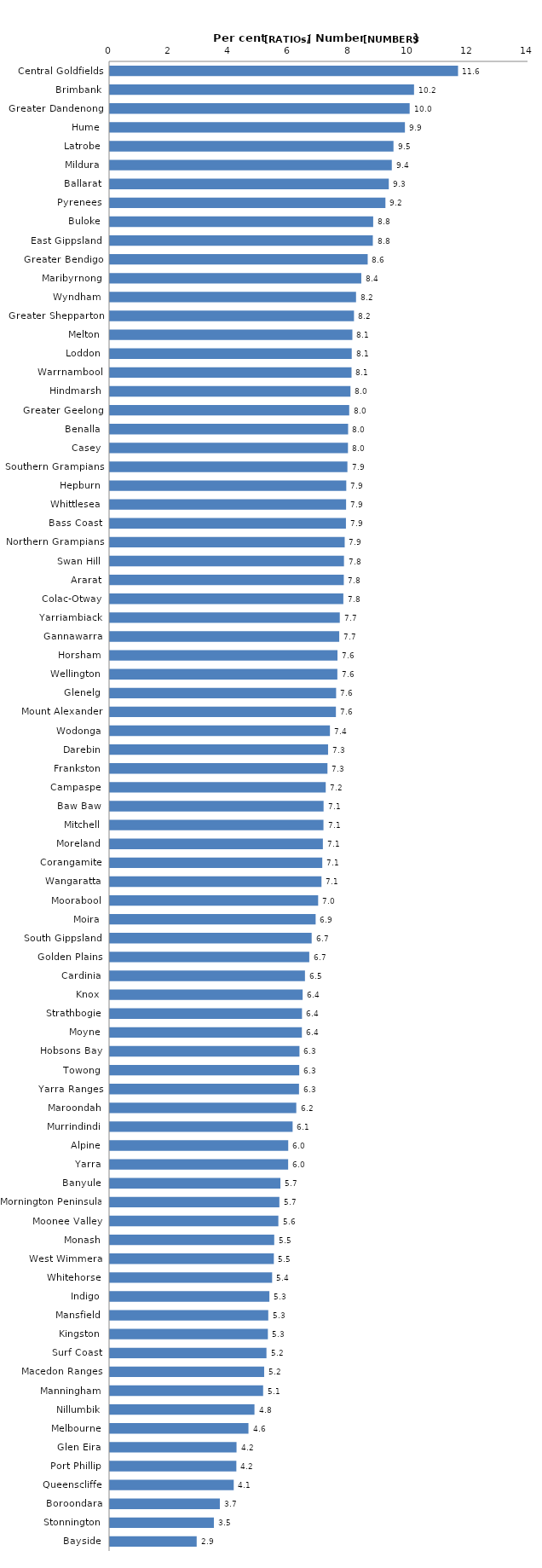
| Category | Series 0 |
|---|---|
| Central Goldfields | 11.647 |
| Brimbank | 10.175 |
| Greater Dandenong | 10.028 |
| Hume | 9.87 |
| Latrobe | 9.487 |
| Mildura | 9.431 |
| Ballarat | 9.33 |
| Pyrenees | 9.217 |
| Buloke | 8.808 |
| East Gippsland | 8.797 |
| Greater Bendigo | 8.624 |
| Maribyrnong | 8.41 |
| Wyndham | 8.234 |
| Greater Shepparton | 8.166 |
| Melton | 8.112 |
| Loddon | 8.09 |
| Warrnambool | 8.083 |
| Hindmarsh | 8.048 |
| Greater Geelong | 8.006 |
| Benalla | 7.969 |
| Casey | 7.964 |
| Southern Grampians | 7.946 |
| Hepburn | 7.907 |
| Whittlesea | 7.901 |
| Bass Coast | 7.896 |
| Northern Grampians | 7.855 |
| Swan Hill | 7.831 |
| Ararat | 7.825 |
| Colac-Otway | 7.809 |
| Yarriambiack | 7.69 |
| Gannawarra | 7.672 |
| Horsham | 7.613 |
| Wellington | 7.609 |
| Glenelg | 7.568 |
| Mount Alexander | 7.561 |
| Wodonga | 7.361 |
| Darebin | 7.299 |
| Frankston | 7.278 |
| Campaspe | 7.22 |
| Baw Baw | 7.148 |
| Mitchell | 7.144 |
| Moreland | 7.125 |
| Corangamite | 7.105 |
| Wangaratta | 7.078 |
| Moorabool | 6.966 |
| Moira | 6.883 |
| South Gippsland | 6.749 |
| Golden Plains | 6.669 |
| Cardinia | 6.525 |
| Knox | 6.448 |
| Strathbogie | 6.426 |
| Moyne | 6.422 |
| Hobsons Bay | 6.341 |
| Towong | 6.334 |
| Yarra Ranges | 6.326 |
| Maroondah | 6.235 |
| Murrindindi | 6.113 |
| Alpine | 5.965 |
| Yarra | 5.963 |
| Banyule | 5.704 |
| Mornington Peninsula | 5.669 |
| Moonee Valley | 5.635 |
| Monash | 5.497 |
| West Wimmera | 5.484 |
| Whitehorse | 5.427 |
| Indigo | 5.335 |
| Mansfield | 5.297 |
| Kingston | 5.285 |
| Surf Coast | 5.237 |
| Macedon Ranges | 5.16 |
| Manningham | 5.126 |
| Nillumbik | 4.836 |
| Melbourne | 4.635 |
| Glen Eira | 4.236 |
| Port Phillip | 4.23 |
| Queenscliffe | 4.142 |
| Boroondara | 3.677 |
| Stonnington | 3.478 |
| Bayside | 2.903 |